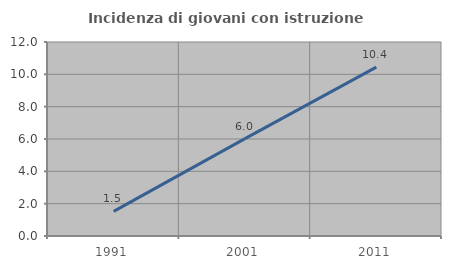
| Category | Incidenza di giovani con istruzione universitaria |
|---|---|
| 1991.0 | 1.527 |
| 2001.0 | 6.024 |
| 2011.0 | 10.448 |